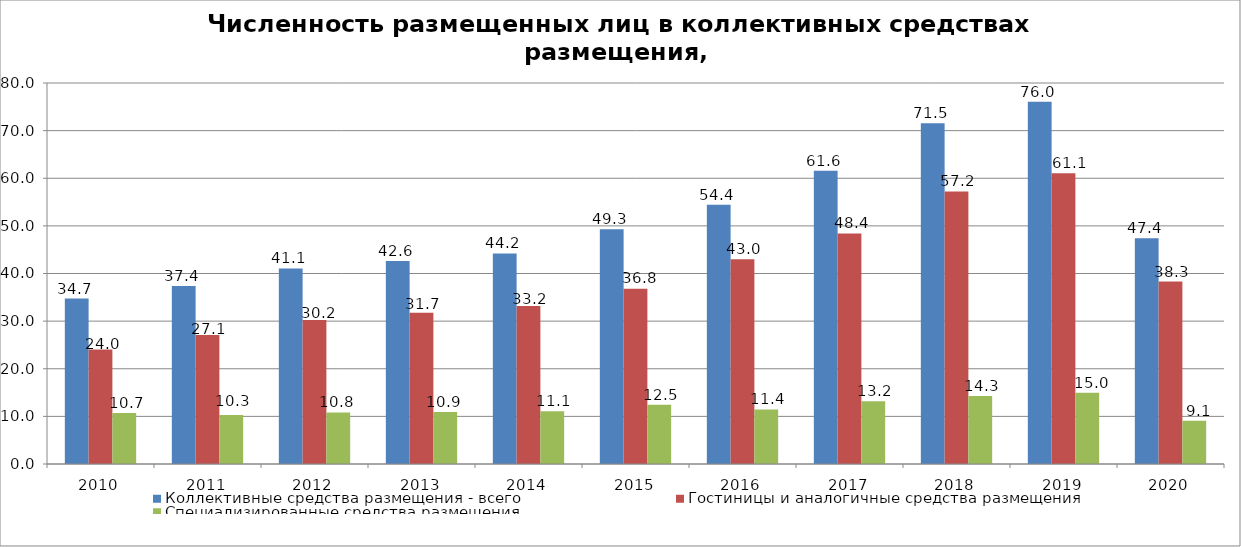
| Category | Коллективные средства размещения - всего | Гостиницы и аналогичные средства размещения | Специализированные средства размещения |
|---|---|---|---|
| 2010.0 | 34.746 | 24.026 | 10.721 |
| 2011.0 | 37.399 | 27.112 | 10.287 |
| 2012.0 | 41.065 | 30.235 | 10.83 |
| 2013.0 | 42.635 | 31.733 | 10.902 |
| 2014.0 | 44.219 | 33.16 | 11.059 |
| 2015.0 | 49.284 | 36.817 | 12.467 |
| 2016.0 | 54.431 | 42.981 | 11.45 |
| 2017.0 | 61.563 | 48.412 | 13.151 |
| 2018.0 | 71.538 | 57.243 | 14.295 |
| 2019.0 | 76.042 | 61.059 | 14.983 |
| 2020.0 | 47.382 | 38.31 | 9.073 |